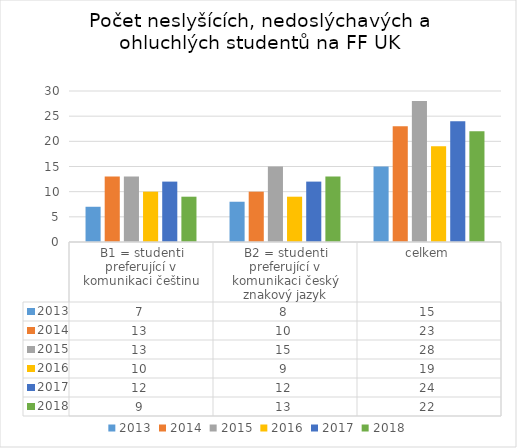
| Category | 2013 | 2014 | 2015 | 2016 | 2017 | 2018 |
|---|---|---|---|---|---|---|
| B1 = studenti preferující v komunikaci češtinu | 7 | 13 | 13 | 10 | 12 | 9 |
| B2 = studenti preferující v komunikaci český znakový jazyk | 8 | 10 | 15 | 9 | 12 | 13 |
| celkem | 15 | 23 | 28 | 19 | 24 | 22 |